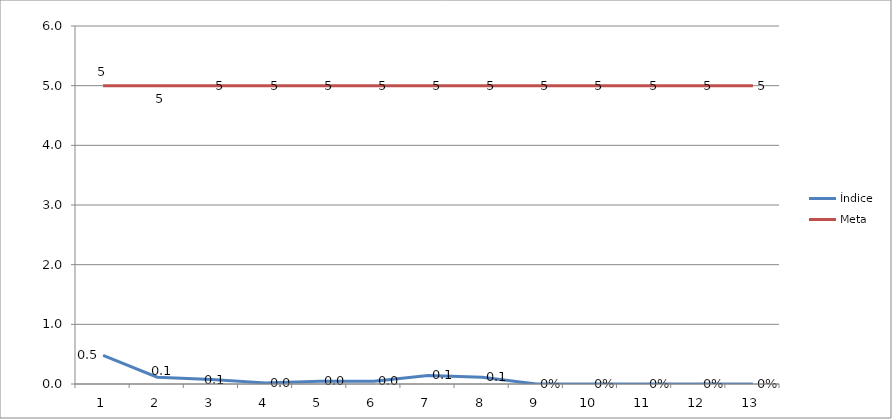
| Category | Índice | Meta |
|---|---|---|
| 0 | 0.48 | 5 |
| 1 | 0.113 | 5 |
| 2 | 0.077 | 5 |
| 3 | 0.019 | 5 |
| 4 | 0.045 | 5 |
| 5 | 0.048 | 5 |
| 6 | 0.143 | 5 |
| 7 | 0.111 | 5 |
| 8 | 0 | 5 |
| 9 | 0 | 5 |
| 10 | 0 | 5 |
| 11 | 0 | 5 |
| 12 | 0 | 5 |